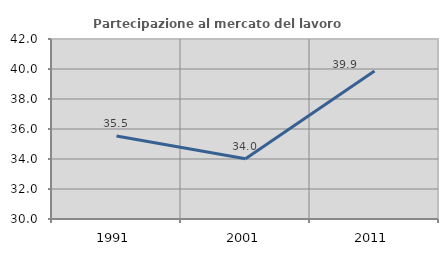
| Category | Partecipazione al mercato del lavoro  femminile |
|---|---|
| 1991.0 | 35.535 |
| 2001.0 | 34.014 |
| 2011.0 | 39.862 |